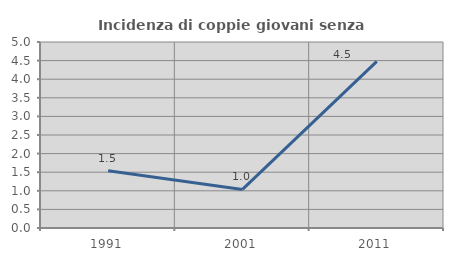
| Category | Incidenza di coppie giovani senza figli |
|---|---|
| 1991.0 | 1.538 |
| 2001.0 | 1.036 |
| 2011.0 | 4.478 |